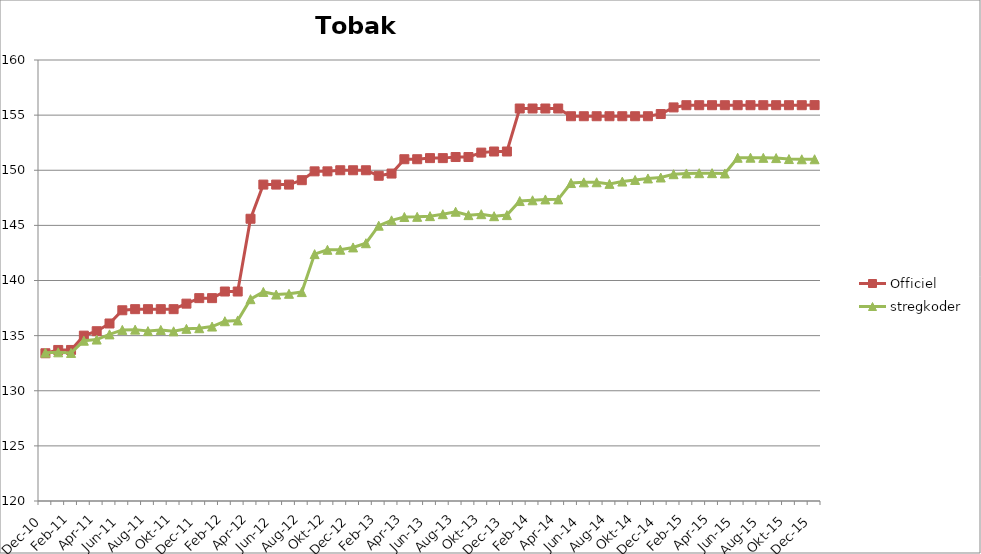
| Category | Officiel | stregkoder |
|---|---|---|
|  Dec-10 | 133.4 | 133.45 |
|  Jan-11 | 133.7 | 133.485 |
|  Feb-11 | 133.7 | 133.43 |
|  Mar-11 | 135 | 134.539 |
|  Apr-11 | 135.4 | 134.642 |
|  Maj-11 | 136.1 | 135.113 |
|  Jun-11 | 137.3 | 135.521 |
|  Jul-11 | 137.4 | 135.544 |
|  Aug-11 | 137.4 | 135.41 |
|  Sep-11 | 137.4 | 135.517 |
|  Okt-11 | 137.4 | 135.39 |
|  Nov-11 | 137.9 | 135.616 |
|  Dec-11 | 138.4 | 135.671 |
|  Jan-12 | 138.4 | 135.823 |
|  Feb-12 | 139 | 136.304 |
|  Mar-12 | 139 | 136.376 |
|  Apr-12 | 145.6 | 138.305 |
|  Maj-12 | 148.7 | 138.964 |
|  Jun-12 | 148.7 | 138.725 |
|  Jul-12 | 148.7 | 138.795 |
|  Aug-12 | 149.1 | 138.949 |
|  Sep-12 | 149.9 | 142.392 |
|  Okt-12 | 149.9 | 142.786 |
|  Nov-12 | 150 | 142.793 |
|  Dec-12 | 150 | 142.999 |
|  Jan-13 | 150 | 143.38 |
|  Feb-13 | 149.5 | 144.971 |
|  Mar-13 | 149.7 | 145.456 |
|  Apr-13 | 151 | 145.76 |
|  Maj-13 | 151 | 145.773 |
|  Jun-13 | 151.1 | 145.838 |
|  Jul-13 | 151.1 | 146.013 |
|  Aug-13 | 151.2 | 146.239 |
|  Sep-13 | 151.2 | 145.929 |
|  Okt-13 | 151.6 | 146.015 |
|  Nov-13 | 151.7 | 145.832 |
|  Dec-13 | 151.7 | 145.932 |
|  Jan-14 | 155.6 | 147.206 |
|  Feb-14 | 155.6 | 147.276 |
|  Mar-14 | 155.6 | 147.351 |
|  Apr-14 | 155.6 | 147.358 |
|  Maj-14 | 154.9 | 148.84 |
|  Jun-14 | 154.9 | 148.903 |
|  Jul-14 | 154.9 | 148.911 |
|  Aug-14 | 154.9 | 148.765 |
|  Sep-14 | 154.9 | 148.975 |
|  Okt-14 | 154.9 | 149.121 |
|  Nov-14 | 154.9 | 149.256 |
|  Dec-14 | 155.1 | 149.342 |
|  Jan-15 | 155.7 | 149.641 |
|  Feb-15 | 155.9 | 149.709 |
|  Mar-15 | 155.9 | 149.732 |
|  Apr-15 | 155.9 | 149.735 |
|  Maj-15 | 155.9 | 149.709 |
| Jun-15 | 155.9 | 151.132 |
| Jul-15 | 155.9 | 151.138 |
| Aug-15 | 155.9 | 151.124 |
| Sep-15 | 155.9 | 151.104 |
| Okt-15 | 155.9 | 151.016 |
| Nov-15 | 155.9 | 150.995 |
| Dec-15 | 155.909 | 150.997 |